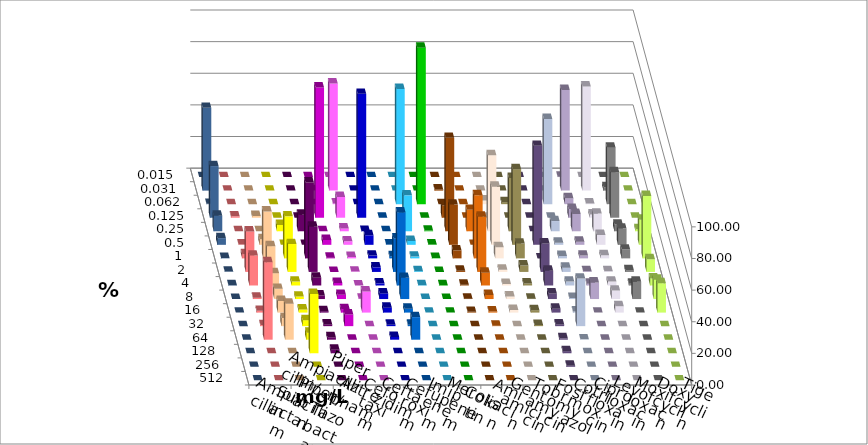
| Category | Ampicillin | Ampicillin/ Sulbactam | Piperacillin | Piperacillin/ Tazobactam | Aztreonam | Cefotaxim | Ceftazidim | Cefuroxim | Imipenem | Meropenem | Colistin | Amikacin | Gentamicin | Tobramycin | Fosfomycin | Cotrimoxazol | Ciprofloxacin | Levofloxacin | Moxifloxacin | Doxycyclin | Tigecyclin |
|---|---|---|---|---|---|---|---|---|---|---|---|---|---|---|---|---|---|---|---|---|---|
| 0.015 | 0 | 0 | 0 | 0 | 0 | 0 | 0 | 0 | 0 | 0 | 0 | 0 | 0 | 0 | 0 | 0 | 0.223 | 0 | 0 | 0 | 0 |
| 0.031 | 0 | 0 | 0 | 0 | 0.223 | 67.706 | 0 | 0 | 0 | 0 | 0.726 | 0 | 0 | 0 | 0 | 0 | 63.697 | 65.848 | 2.232 | 0 | 52.349 |
| 0.062 | 0 | 0 | 0 | 0 | 0 | 0.445 | 0 | 0 | 72.829 | 98.884 | 0 | 0 | 2.37 | 1.266 | 0 | 53.898 | 3.786 | 0.446 | 35.714 | 0 | 0.224 |
| 0.125 | 0.891 | 1.114 | 0 | 0 | 82.366 | 13.14 | 78.348 | 0 | 0.223 | 0 | 7.748 | 0 | 0 | 0 | 0 | 0 | 5.568 | 2.009 | 28.795 | 0 | 32.662 |
| 0.25 | 0 | 0 | 4.018 | 10.491 | 0 | 1.782 | 0.223 | 0 | 22.717 | 0.446 | 59.08 | 13.539 | 48.104 | 33.671 | 0 | 6.459 | 10.913 | 11.161 | 4.241 | 1.339 | 9.843 |
| 0.5 | 0.223 | 3.563 | 0 | 0 | 3.125 | 2.227 | 6.027 | 0.223 | 2.45 | 0.223 | 25.424 | 0 | 36.73 | 47.848 | 62.584 | 1.336 | 2.004 | 6.25 | 10.268 | 15.848 | 4.251 |
| 1.0 | 2.673 | 29.621 | 26.562 | 47.991 | 0.446 | 0.891 | 1.786 | 1.339 | 1.114 | 0.223 | 5.085 | 39.905 | 7.109 | 9.367 | 0 | 1.559 | 1.782 | 2.009 | 5.58 | 39.509 | 0.224 |
| 2.0 | 25.612 | 16.258 | 17.634 | 28.571 | 0 | 0.223 | 2.902 | 21.205 | 0.445 | 0 | 0.726 | 34.917 | 1.422 | 4.051 | 18.04 | 2.673 | 0.445 | 0.446 | 1.116 | 8.036 | 0.224 |
| 4.0 | 18.931 | 7.795 | 2.455 | 4.911 | 1.562 | 0 | 1.339 | 46.205 | 0.223 | 0.223 | 0.484 | 8.076 | 0.948 | 1.266 | 9.354 | 2.45 | 1.114 | 2.455 | 1.116 | 4.464 | 0.224 |
| 8.0 | 0.891 | 6.459 | 1.562 | 2.232 | 2.679 | 0.223 | 3.571 | 13.393 | 0 | 0 | 0.242 | 2.613 | 1.659 | 0.253 | 3.563 | 0.668 | 10.468 | 5.357 | 10.938 | 12.277 | 0 |
| 16.0 | 1.114 | 7.35 | 2.009 | 0.893 | 2.232 | 13.363 | 3.125 | 2.455 | 0 | 0 | 0.484 | 0.713 | 1.659 | 1.519 | 2.45 | 0.668 | 0 | 4.018 | 0 | 18.527 | 0 |
| 32.0 | 0.668 | 5.122 | 3.795 | 1.116 | 7.366 | 0 | 0.893 | 0.893 | 0 | 0 | 0 | 0.238 | 0 | 0.759 | 1.114 | 30.067 | 0 | 0 | 0 | 0 | 0 |
| 64.0 | 48.998 | 22.717 | 4.464 | 1.562 | 0 | 0 | 1.786 | 14.286 | 0 | 0 | 0 | 0 | 0 | 0 | 0.891 | 0.223 | 0 | 0 | 0 | 0 | 0 |
| 128.0 | 0 | 0 | 37.5 | 2.232 | 0 | 0 | 0 | 0 | 0 | 0 | 0 | 0 | 0 | 0 | 1.336 | 0 | 0 | 0 | 0 | 0 | 0 |
| 256.0 | 0 | 0 | 0 | 0 | 0 | 0 | 0 | 0 | 0 | 0 | 0 | 0 | 0 | 0 | 0.668 | 0 | 0 | 0 | 0 | 0 | 0 |
| 512.0 | 0 | 0 | 0 | 0 | 0 | 0 | 0 | 0 | 0 | 0 | 0 | 0 | 0 | 0 | 0 | 0 | 0 | 0 | 0 | 0 | 0 |